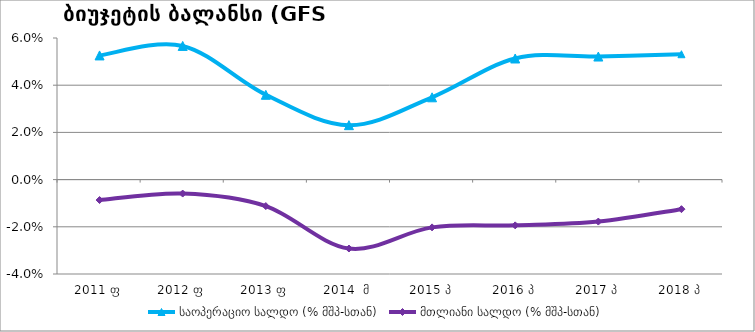
| Category | საოპერაციო სალდო (% მშპ-სთან) |
|---|---|
| 2011 ფ | 0.053 |
| 2012 ფ | 0.057 |
| 2013 ფ | 0.036 |
| 2014  მ | 0.023 |
| 2015 პ | 0.035 |
| 2016 პ | 0.051 |
| 2017 პ | 0.052 |
| 2018 პ | 0.053 |